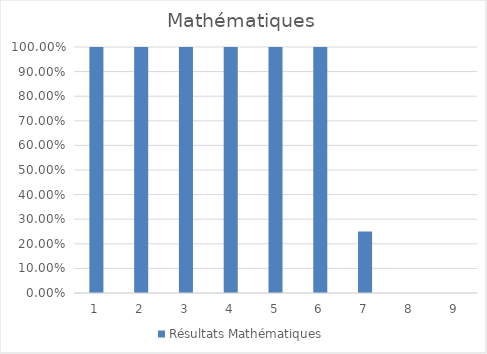
| Category | Résultats Mathématiques |
|---|---|
| 0 | 1 |
| 1 | 1 |
| 2 | 1 |
| 3 | 1 |
| 4 | 1 |
| 5 | 1 |
| 6 | 0.25 |
| 7 | 0 |
| 8 | 0 |